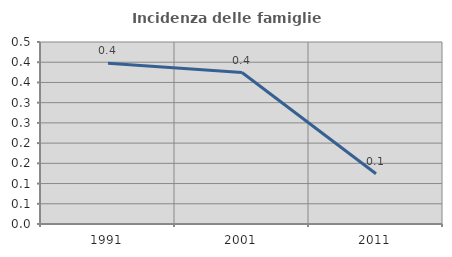
| Category | Incidenza delle famiglie numerose |
|---|---|
| 1991.0 | 0.397 |
| 2001.0 | 0.375 |
| 2011.0 | 0.124 |